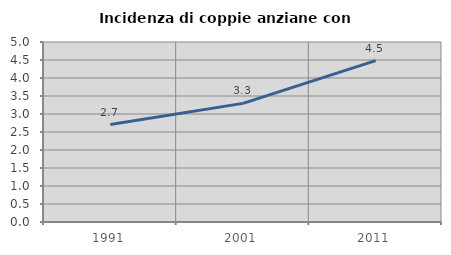
| Category | Incidenza di coppie anziane con figli |
|---|---|
| 1991.0 | 2.706 |
| 2001.0 | 3.295 |
| 2011.0 | 4.484 |